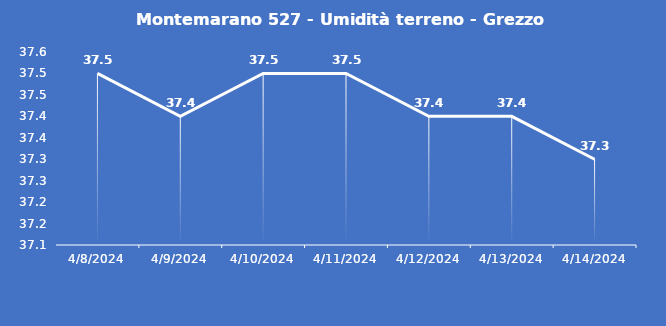
| Category | Montemarano 527 - Umidità terreno - Grezzo (%VWC) |
|---|---|
| 4/8/24 | 37.5 |
| 4/9/24 | 37.4 |
| 4/10/24 | 37.5 |
| 4/11/24 | 37.5 |
| 4/12/24 | 37.4 |
| 4/13/24 | 37.4 |
| 4/14/24 | 37.3 |